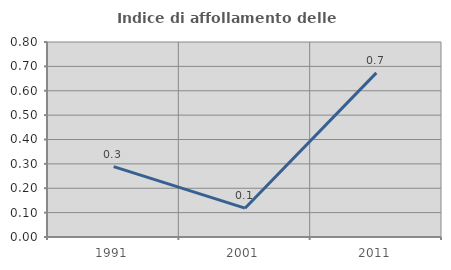
| Category | Indice di affollamento delle abitazioni  |
|---|---|
| 1991.0 | 0.289 |
| 2001.0 | 0.118 |
| 2011.0 | 0.673 |